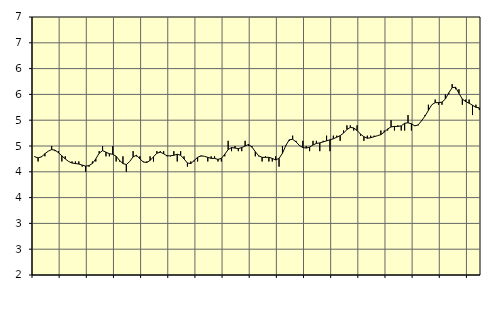
| Category | Piggar | Personliga och kulturella tjänster, SNI 90-98 |
|---|---|---|
| nan | 4.3 | 4.29 |
| 87.0 | 4.2 | 4.27 |
| 87.0 | 4.3 | 4.29 |
| 87.0 | 4.3 | 4.35 |
| nan | 4.4 | 4.4 |
| 88.0 | 4.5 | 4.43 |
| 88.0 | 4.4 | 4.42 |
| 88.0 | 4.4 | 4.37 |
| nan | 4.2 | 4.31 |
| 89.0 | 4.3 | 4.25 |
| 89.0 | 4.2 | 4.2 |
| 89.0 | 4.2 | 4.17 |
| nan | 4.2 | 4.16 |
| 90.0 | 4.2 | 4.15 |
| 90.0 | 4.1 | 4.13 |
| 90.0 | 4 | 4.11 |
| nan | 4.1 | 4.12 |
| 91.0 | 4.2 | 4.16 |
| 91.0 | 4.2 | 4.25 |
| 91.0 | 4.4 | 4.36 |
| nan | 4.5 | 4.41 |
| 92.0 | 4.3 | 4.38 |
| 92.0 | 4.3 | 4.35 |
| 92.0 | 4.5 | 4.34 |
| nan | 4.2 | 4.3 |
| 93.0 | 4.2 | 4.22 |
| 93.0 | 4.3 | 4.16 |
| 93.0 | 4 | 4.14 |
| nan | 4.2 | 4.2 |
| 94.0 | 4.4 | 4.29 |
| 94.0 | 4.3 | 4.32 |
| 94.0 | 4.3 | 4.25 |
| nan | 4.2 | 4.19 |
| 95.0 | 4.2 | 4.18 |
| 95.0 | 4.3 | 4.22 |
| 95.0 | 4.2 | 4.29 |
| nan | 4.4 | 4.36 |
| 96.0 | 4.4 | 4.38 |
| 96.0 | 4.4 | 4.35 |
| 96.0 | 4.3 | 4.31 |
| nan | 4.3 | 4.31 |
| 97.0 | 4.4 | 4.32 |
| 97.0 | 4.2 | 4.34 |
| 97.0 | 4.4 | 4.32 |
| nan | 4.3 | 4.25 |
| 98.0 | 4.1 | 4.17 |
| 98.0 | 4.2 | 4.16 |
| 98.0 | 4.2 | 4.22 |
| nan | 4.2 | 4.28 |
| 99.0 | 4.3 | 4.31 |
| 99.0 | 4.3 | 4.3 |
| 99.0 | 4.2 | 4.28 |
| nan | 4.3 | 4.26 |
| 0.0 | 4.3 | 4.26 |
| 0.0 | 4.2 | 4.24 |
| 0.0 | 4.2 | 4.26 |
| nan | 4.3 | 4.34 |
| 1.0 | 4.6 | 4.43 |
| 1.0 | 4.4 | 4.47 |
| 1.0 | 4.5 | 4.46 |
| nan | 4.4 | 4.45 |
| 2.0 | 4.4 | 4.47 |
| 2.0 | 4.6 | 4.5 |
| 2.0 | 4.5 | 4.53 |
| nan | 4.5 | 4.48 |
| 3.0 | 4.3 | 4.39 |
| 3.0 | 4.3 | 4.31 |
| 3.0 | 4.2 | 4.28 |
| nan | 4.3 | 4.28 |
| 4.0 | 4.2 | 4.28 |
| 4.0 | 4.2 | 4.26 |
| 4.0 | 4.3 | 4.23 |
| nan | 4.1 | 4.26 |
| 5.0 | 4.5 | 4.36 |
| 5.0 | 4.5 | 4.51 |
| 5.0 | 4.6 | 4.62 |
| nan | 4.7 | 4.63 |
| 6.0 | 4.6 | 4.58 |
| 6.0 | 4.5 | 4.51 |
| 6.0 | 4.6 | 4.47 |
| nan | 4.5 | 4.46 |
| 7.0 | 4.4 | 4.48 |
| 7.0 | 4.6 | 4.52 |
| 7.0 | 4.6 | 4.55 |
| nan | 4.4 | 4.56 |
| 8.0 | 4.6 | 4.58 |
| 8.0 | 4.7 | 4.6 |
| 8.0 | 4.4 | 4.62 |
| nan | 4.7 | 4.64 |
| 9.0 | 4.7 | 4.67 |
| 9.0 | 4.6 | 4.7 |
| 9.0 | 4.8 | 4.75 |
| nan | 4.9 | 4.82 |
| 10.0 | 4.9 | 4.86 |
| 10.0 | 4.8 | 4.85 |
| 10.0 | 4.9 | 4.8 |
| nan | 4.7 | 4.73 |
| 11.0 | 4.6 | 4.68 |
| 11.0 | 4.7 | 4.65 |
| 11.0 | 4.7 | 4.66 |
| nan | 4.7 | 4.68 |
| 12.0 | 4.7 | 4.7 |
| 12.0 | 4.8 | 4.72 |
| 12.0 | 4.8 | 4.77 |
| nan | 4.8 | 4.83 |
| 13.0 | 5 | 4.87 |
| 13.0 | 4.8 | 4.88 |
| 13.0 | 4.9 | 4.88 |
| nan | 4.8 | 4.89 |
| 14.0 | 4.8 | 4.94 |
| 14.0 | 5.1 | 4.95 |
| 14.0 | 4.8 | 4.93 |
| nan | 4.9 | 4.89 |
| 15.0 | 4.9 | 4.91 |
| 15.0 | 5 | 4.99 |
| 15.0 | 5.1 | 5.08 |
| nan | 5.3 | 5.19 |
| 16.0 | 5.3 | 5.3 |
| 16.0 | 5.4 | 5.34 |
| 16.0 | 5.3 | 5.34 |
| nan | 5.3 | 5.35 |
| 17.0 | 5.5 | 5.41 |
| 17.0 | 5.5 | 5.53 |
| 17.0 | 5.7 | 5.63 |
| nan | 5.6 | 5.64 |
| 18.0 | 5.6 | 5.52 |
| 18.0 | 5.3 | 5.41 |
| 18.0 | 5.4 | 5.36 |
| nan | 5.4 | 5.33 |
| 19.0 | 5.1 | 5.29 |
| 19.0 | 5.3 | 5.25 |
| 19.0 | 5.2 | 5.24 |